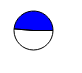
| Category | Series 0 |
|---|---|
| 0 | 50683 |
| 1 | 48077 |